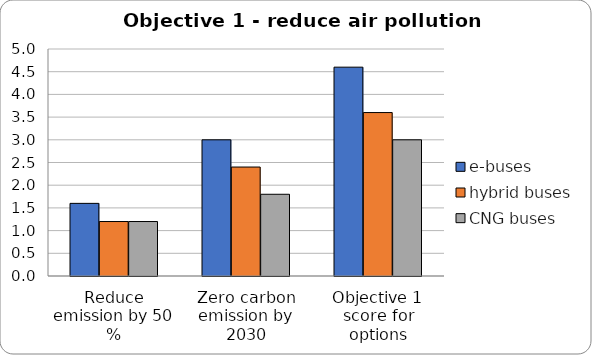
| Category | e-buses | hybrid buses | CNG buses |
|---|---|---|---|
| Reduce emission by 50 % | 1.6 | 1.2 | 1.2 |
| Zero carbon emission by 2030 | 3 | 2.4 | 1.8 |
| Objective 1 score for options | 4.6 | 3.6 | 3 |